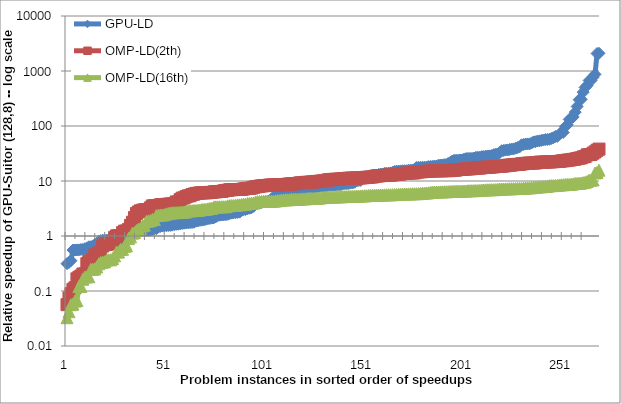
| Category | GPU-LD | OMP-LD(2th) | OMP-LD(16th) |
|---|---|---|---|
| 0 | 0.314 | 0.056 | 0.033 |
| 1 | 0.331 | 0.075 | 0.042 |
| 2 | 0.356 | 0.09 | 0.056 |
| 3 | 0.555 | 0.107 | 0.058 |
| 4 | 0.556 | 0.114 | 0.066 |
| 5 | 0.558 | 0.166 | 0.067 |
| 6 | 0.56 | 0.177 | 0.12 |
| 7 | 0.569 | 0.187 | 0.121 |
| 8 | 0.57 | 0.204 | 0.163 |
| 9 | 0.587 | 0.205 | 0.18 |
| 10 | 0.606 | 0.314 | 0.181 |
| 11 | 0.636 | 0.342 | 0.182 |
| 12 | 0.637 | 0.356 | 0.247 |
| 13 | 0.66 | 0.377 | 0.249 |
| 14 | 0.697 | 0.451 | 0.252 |
| 15 | 0.712 | 0.463 | 0.274 |
| 16 | 0.797 | 0.488 | 0.312 |
| 17 | 0.825 | 0.511 | 0.33 |
| 18 | 0.838 | 0.659 | 0.334 |
| 19 | 0.84 | 0.695 | 0.341 |
| 20 | 0.841 | 0.698 | 0.366 |
| 21 | 0.848 | 0.726 | 0.37 |
| 22 | 0.855 | 0.728 | 0.371 |
| 23 | 0.867 | 0.764 | 0.387 |
| 24 | 0.868 | 0.944 | 0.434 |
| 25 | 0.87 | 1.007 | 0.511 |
| 26 | 0.873 | 1.015 | 0.512 |
| 27 | 0.876 | 1.02 | 0.568 |
| 28 | 0.891 | 1.151 | 0.574 |
| 29 | 0.916 | 1.226 | 0.647 |
| 30 | 0.991 | 1.237 | 0.663 |
| 31 | 1.013 | 1.32 | 0.902 |
| 32 | 1.015 | 1.564 | 0.965 |
| 33 | 1.168 | 1.783 | 1.128 |
| 34 | 1.201 | 2.161 | 1.151 |
| 35 | 1.255 | 2.571 | 1.252 |
| 36 | 1.256 | 2.74 | 1.334 |
| 37 | 1.271 | 2.87 | 1.374 |
| 38 | 1.271 | 2.944 | 1.523 |
| 39 | 1.272 | 2.997 | 1.58 |
| 40 | 1.272 | 2.998 | 1.834 |
| 41 | 1.273 | 3.017 | 1.887 |
| 42 | 1.278 | 3.249 | 1.896 |
| 43 | 1.316 | 3.521 | 1.998 |
| 44 | 1.347 | 3.56 | 2.002 |
| 45 | 1.358 | 3.566 | 2.347 |
| 46 | 1.447 | 3.578 | 2.38 |
| 47 | 1.486 | 3.696 | 2.41 |
| 48 | 1.514 | 3.715 | 2.416 |
| 49 | 1.526 | 3.729 | 2.439 |
| 50 | 1.545 | 3.76 | 2.518 |
| 51 | 1.55 | 3.771 | 2.572 |
| 52 | 1.554 | 3.826 | 2.611 |
| 53 | 1.573 | 3.831 | 2.644 |
| 54 | 1.607 | 3.845 | 2.66 |
| 55 | 1.63 | 4.158 | 2.666 |
| 56 | 1.64 | 4.162 | 2.668 |
| 57 | 1.663 | 4.585 | 2.694 |
| 58 | 1.683 | 4.871 | 2.713 |
| 59 | 1.705 | 4.952 | 2.732 |
| 60 | 1.726 | 5.186 | 2.747 |
| 61 | 1.741 | 5.363 | 2.862 |
| 62 | 1.748 | 5.396 | 2.877 |
| 63 | 1.756 | 5.688 | 2.883 |
| 64 | 1.777 | 5.774 | 2.909 |
| 65 | 1.862 | 5.954 | 2.915 |
| 66 | 1.888 | 5.96 | 2.939 |
| 67 | 1.923 | 6.082 | 2.963 |
| 68 | 1.941 | 6.098 | 3.037 |
| 69 | 1.971 | 6.101 | 3.047 |
| 70 | 2.012 | 6.109 | 3.061 |
| 71 | 2.059 | 6.142 | 3.122 |
| 72 | 2.08 | 6.192 | 3.17 |
| 73 | 2.118 | 6.207 | 3.191 |
| 74 | 2.137 | 6.347 | 3.379 |
| 75 | 2.231 | 6.35 | 3.386 |
| 76 | 2.351 | 6.43 | 3.386 |
| 77 | 2.396 | 6.452 | 3.4 |
| 78 | 2.41 | 6.46 | 3.4 |
| 79 | 2.43 | 6.634 | 3.404 |
| 80 | 2.436 | 6.737 | 3.419 |
| 81 | 2.477 | 6.78 | 3.536 |
| 82 | 2.555 | 6.943 | 3.567 |
| 83 | 2.599 | 6.945 | 3.589 |
| 84 | 2.647 | 6.986 | 3.592 |
| 85 | 2.649 | 6.997 | 3.613 |
| 86 | 2.691 | 7 | 3.685 |
| 87 | 2.716 | 7.009 | 3.689 |
| 88 | 2.943 | 7.043 | 3.738 |
| 89 | 3.006 | 7.167 | 3.79 |
| 90 | 3.029 | 7.281 | 3.794 |
| 91 | 3.136 | 7.345 | 3.905 |
| 92 | 3.194 | 7.356 | 3.912 |
| 93 | 3.27 | 7.443 | 3.968 |
| 94 | 3.468 | 7.683 | 3.97 |
| 95 | 3.821 | 7.829 | 4.15 |
| 96 | 3.916 | 7.91 | 4.222 |
| 97 | 3.967 | 8.059 | 4.233 |
| 98 | 4.054 | 8.134 | 4.251 |
| 99 | 4.178 | 8.219 | 4.267 |
| 100 | 4.179 | 8.246 | 4.269 |
| 101 | 4.296 | 8.295 | 4.273 |
| 102 | 4.356 | 8.435 | 4.292 |
| 103 | 4.657 | 8.459 | 4.299 |
| 104 | 5.126 | 8.475 | 4.302 |
| 105 | 5.198 | 8.481 | 4.347 |
| 106 | 5.226 | 8.496 | 4.397 |
| 107 | 5.283 | 8.507 | 4.406 |
| 108 | 5.389 | 8.54 | 4.526 |
| 109 | 5.394 | 8.597 | 4.53 |
| 110 | 5.486 | 8.648 | 4.553 |
| 111 | 5.519 | 8.697 | 4.562 |
| 112 | 5.551 | 8.84 | 4.572 |
| 113 | 5.802 | 8.851 | 4.643 |
| 114 | 6.166 | 8.894 | 4.66 |
| 115 | 6.191 | 8.93 | 4.661 |
| 116 | 6.311 | 9.003 | 4.664 |
| 117 | 6.469 | 9.21 | 4.68 |
| 118 | 6.934 | 9.265 | 4.728 |
| 119 | 6.952 | 9.36 | 4.731 |
| 120 | 7.046 | 9.423 | 4.751 |
| 121 | 7.098 | 9.443 | 4.782 |
| 122 | 7.114 | 9.478 | 4.819 |
| 123 | 7.133 | 9.581 | 4.833 |
| 124 | 7.568 | 9.613 | 4.837 |
| 125 | 7.695 | 9.729 | 4.857 |
| 126 | 7.765 | 9.827 | 4.865 |
| 127 | 7.963 | 9.831 | 4.892 |
| 128 | 8.022 | 9.99 | 4.965 |
| 129 | 8.131 | 10.028 | 5.002 |
| 130 | 8.173 | 10.089 | 5.028 |
| 131 | 8.177 | 10.359 | 5.065 |
| 132 | 8.348 | 10.534 | 5.092 |
| 133 | 8.378 | 10.616 | 5.127 |
| 134 | 8.399 | 10.678 | 5.131 |
| 135 | 8.461 | 10.75 | 5.133 |
| 136 | 8.527 | 10.755 | 5.159 |
| 137 | 8.538 | 10.76 | 5.163 |
| 138 | 8.545 | 10.888 | 5.176 |
| 139 | 8.876 | 11.053 | 5.209 |
| 140 | 8.945 | 11.103 | 5.211 |
| 141 | 8.958 | 11.142 | 5.217 |
| 142 | 9.009 | 11.234 | 5.237 |
| 143 | 9.226 | 11.266 | 5.239 |
| 144 | 9.254 | 11.266 | 5.248 |
| 145 | 9.491 | 11.266 | 5.278 |
| 146 | 10.076 | 11.346 | 5.306 |
| 147 | 10.217 | 11.388 | 5.324 |
| 148 | 10.245 | 11.404 | 5.35 |
| 149 | 11.136 | 11.463 | 5.369 |
| 150 | 11.57 | 11.528 | 5.392 |
| 151 | 11.672 | 11.688 | 5.403 |
| 152 | 12.295 | 11.71 | 5.467 |
| 153 | 12.413 | 11.832 | 5.478 |
| 154 | 12.808 | 11.84 | 5.502 |
| 155 | 12.827 | 12.152 | 5.528 |
| 156 | 12.846 | 12.292 | 5.54 |
| 157 | 13.146 | 12.409 | 5.567 |
| 158 | 13.369 | 12.52 | 5.568 |
| 159 | 13.392 | 12.567 | 5.57 |
| 160 | 13.861 | 12.591 | 5.593 |
| 161 | 13.869 | 12.746 | 5.611 |
| 162 | 13.883 | 12.807 | 5.626 |
| 163 | 14.064 | 12.815 | 5.631 |
| 164 | 14.306 | 12.896 | 5.642 |
| 165 | 14.927 | 13.088 | 5.672 |
| 166 | 15.086 | 13.217 | 5.674 |
| 167 | 15.167 | 13.302 | 5.764 |
| 168 | 15.226 | 13.366 | 5.768 |
| 169 | 15.352 | 13.689 | 5.787 |
| 170 | 15.38 | 13.697 | 5.817 |
| 171 | 15.386 | 13.846 | 5.819 |
| 172 | 15.681 | 14.004 | 5.834 |
| 173 | 15.762 | 14.013 | 5.847 |
| 174 | 15.825 | 14.03 | 5.871 |
| 175 | 16.156 | 14.035 | 5.875 |
| 176 | 17.593 | 14.456 | 5.88 |
| 177 | 17.673 | 14.558 | 5.886 |
| 178 | 17.728 | 14.744 | 5.948 |
| 179 | 17.754 | 14.746 | 6.022 |
| 180 | 17.782 | 14.88 | 6.026 |
| 181 | 17.867 | 14.912 | 6.055 |
| 182 | 18.312 | 15.071 | 6.095 |
| 183 | 18.349 | 15.21 | 6.192 |
| 184 | 18.451 | 15.284 | 6.291 |
| 185 | 18.629 | 15.301 | 6.293 |
| 186 | 18.649 | 15.324 | 6.312 |
| 187 | 19.29 | 15.362 | 6.333 |
| 188 | 19.488 | 15.366 | 6.344 |
| 189 | 19.542 | 15.391 | 6.355 |
| 190 | 19.842 | 15.409 | 6.369 |
| 191 | 19.854 | 15.423 | 6.391 |
| 192 | 20.83 | 15.442 | 6.405 |
| 193 | 21.595 | 15.46 | 6.44 |
| 194 | 23.021 | 15.706 | 6.444 |
| 195 | 23.782 | 15.714 | 6.499 |
| 196 | 23.867 | 15.789 | 6.512 |
| 197 | 23.883 | 16.167 | 6.53 |
| 198 | 24.088 | 16.177 | 6.532 |
| 199 | 24.224 | 16.183 | 6.556 |
| 200 | 24.974 | 16.416 | 6.579 |
| 201 | 25.63 | 16.545 | 6.582 |
| 202 | 25.7 | 16.605 | 6.653 |
| 203 | 25.722 | 16.648 | 6.665 |
| 204 | 25.755 | 16.795 | 6.674 |
| 205 | 26.185 | 17.102 | 6.694 |
| 206 | 26.936 | 17.124 | 6.696 |
| 207 | 26.974 | 17.171 | 6.713 |
| 208 | 27.072 | 17.202 | 6.761 |
| 209 | 27.804 | 17.46 | 6.848 |
| 210 | 27.83 | 17.741 | 6.878 |
| 211 | 28.283 | 17.758 | 6.892 |
| 212 | 28.519 | 17.803 | 6.925 |
| 213 | 28.595 | 17.864 | 6.946 |
| 214 | 29.016 | 18.057 | 6.956 |
| 215 | 30.07 | 18.057 | 6.964 |
| 216 | 30.861 | 18.381 | 6.985 |
| 217 | 31.086 | 18.384 | 7.081 |
| 218 | 32.751 | 18.571 | 7.142 |
| 219 | 35.508 | 18.64 | 7.158 |
| 220 | 35.863 | 18.755 | 7.165 |
| 221 | 36.617 | 19 | 7.183 |
| 222 | 36.695 | 19.334 | 7.211 |
| 223 | 37.452 | 19.367 | 7.223 |
| 224 | 38.102 | 19.525 | 7.264 |
| 225 | 38.304 | 19.805 | 7.266 |
| 226 | 39.53 | 19.964 | 7.286 |
| 227 | 40.522 | 20.044 | 7.305 |
| 228 | 41.685 | 20.063 | 7.326 |
| 229 | 45.548 | 20.52 | 7.331 |
| 230 | 46 | 20.638 | 7.405 |
| 231 | 47.034 | 20.892 | 7.459 |
| 232 | 47.21 | 21.02 | 7.49 |
| 233 | 47.214 | 21.179 | 7.528 |
| 234 | 48.964 | 21.208 | 7.554 |
| 235 | 51.376 | 21.253 | 7.658 |
| 236 | 51.726 | 21.264 | 7.673 |
| 237 | 53.333 | 21.627 | 7.797 |
| 238 | 53.677 | 21.971 | 7.826 |
| 239 | 54.875 | 21.974 | 7.876 |
| 240 | 55.594 | 21.981 | 7.932 |
| 241 | 56.661 | 22.118 | 7.963 |
| 242 | 56.915 | 22.204 | 8.05 |
| 243 | 57.464 | 22.233 | 8.192 |
| 244 | 59.377 | 22.283 | 8.241 |
| 245 | 61.103 | 22.491 | 8.258 |
| 246 | 64.562 | 22.573 | 8.273 |
| 247 | 64.687 | 22.647 | 8.294 |
| 248 | 71.033 | 22.683 | 8.452 |
| 249 | 75.28 | 23.103 | 8.535 |
| 250 | 76.287 | 23.323 | 8.544 |
| 251 | 96.74 | 23.437 | 8.617 |
| 252 | 104.781 | 23.956 | 8.682 |
| 253 | 131.595 | 23.984 | 8.71 |
| 254 | 137.826 | 24.354 | 8.746 |
| 255 | 145.904 | 24.742 | 8.853 |
| 256 | 178.65 | 24.961 | 9.051 |
| 257 | 226.539 | 25.589 | 9.069 |
| 258 | 300.999 | 26.094 | 9.09 |
| 259 | 304.698 | 26.295 | 9.19 |
| 260 | 411.807 | 27.434 | 9.339 |
| 261 | 501.963 | 27.858 | 9.477 |
| 262 | 545.579 | 29.845 | 9.775 |
| 263 | 670.609 | 30.217 | 10.34 |
| 264 | 672.635 | 30.353 | 10.402 |
| 265 | 770.379 | 32.075 | 10.436 |
| 266 | 868.812 | 33.818 | 13.994 |
| 267 | 2080.709 | 36.223 | 14.239 |
| 268 | 2101.717 | 38.03 | 15.684 |